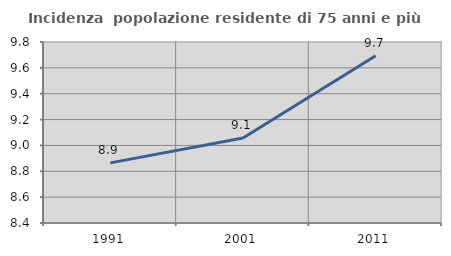
| Category | Incidenza  popolazione residente di 75 anni e più |
|---|---|
| 1991.0 | 8.865 |
| 2001.0 | 9.058 |
| 2011.0 | 9.694 |